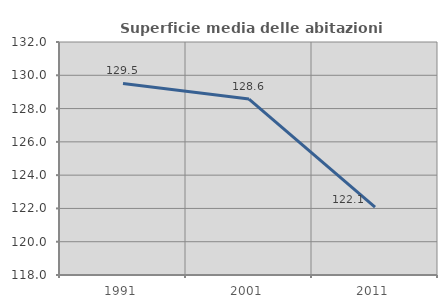
| Category | Superficie media delle abitazioni occupate |
|---|---|
| 1991.0 | 129.508 |
| 2001.0 | 128.573 |
| 2011.0 | 122.08 |